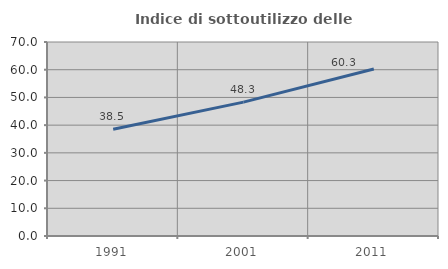
| Category | Indice di sottoutilizzo delle abitazioni  |
|---|---|
| 1991.0 | 38.532 |
| 2001.0 | 48.305 |
| 2011.0 | 60.256 |